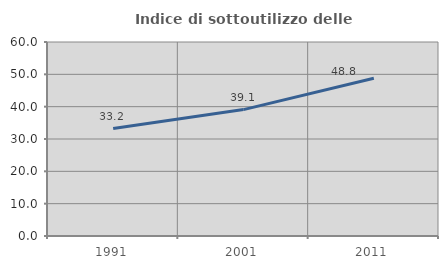
| Category | Indice di sottoutilizzo delle abitazioni  |
|---|---|
| 1991.0 | 33.245 |
| 2001.0 | 39.093 |
| 2011.0 | 48.785 |